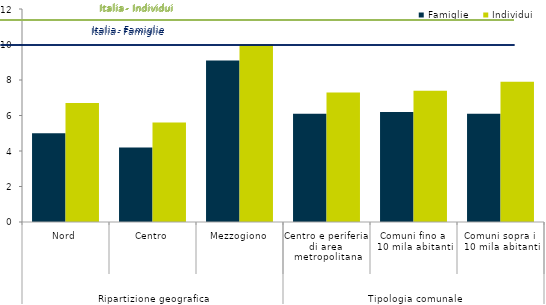
| Category | Famiglie | Individui |
|---|---|---|
| 0 | 5 | 6.7 |
| 1 | 4.2 | 5.6 |
| 2 | 9.1 | 10 |
| 3 | 6.1 | 7.3 |
| 4 | 6.2 | 7.4 |
| 5 | 6.1 | 7.9 |